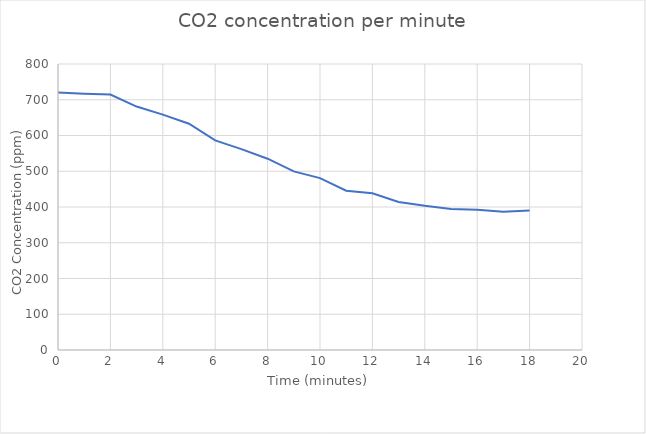
| Category | Series 0 |
|---|---|
| 0.0 | 720.1 |
| 1.0 | 717 |
| 2.0 | 714.6 |
| 3.0 | 681 |
| 4.0 | 658.4 |
| 5.0 | 632.8 |
| 6.0 | 586.4 |
| 7.0 | 562 |
| 8.0 | 535.1 |
| 9.0 | 499.7 |
| 10.0 | 480.8 |
| 11.0 | 445.4 |
| 12.0 | 438.6 |
| 13.0 | 414.2 |
| 14.0 | 403.2 |
| 15.0 | 394.7 |
| 16.0 | 392.2 |
| 17.0 | 386.7 |
| 18.0 | 390.4 |